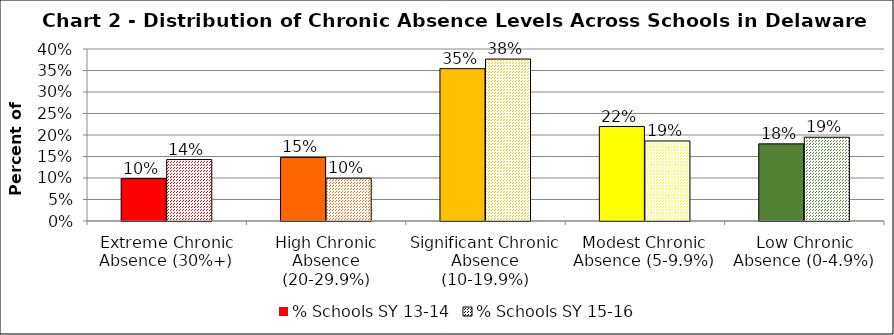
| Category | % Schools SY 13-14 | % Schools SY 15-16 |
|---|---|---|
| Extreme Chronic Absence (30%+) | 0.099 | 0.143 |
| High Chronic Absence (20-29.9%) | 0.148 | 0.1 |
| Significant Chronic Absence (10-19.9%) | 0.354 | 0.377 |
| Modest Chronic Absence (5-9.9%) | 0.22 | 0.186 |
| Low Chronic Absence (0-4.9%) | 0.179 | 0.195 |